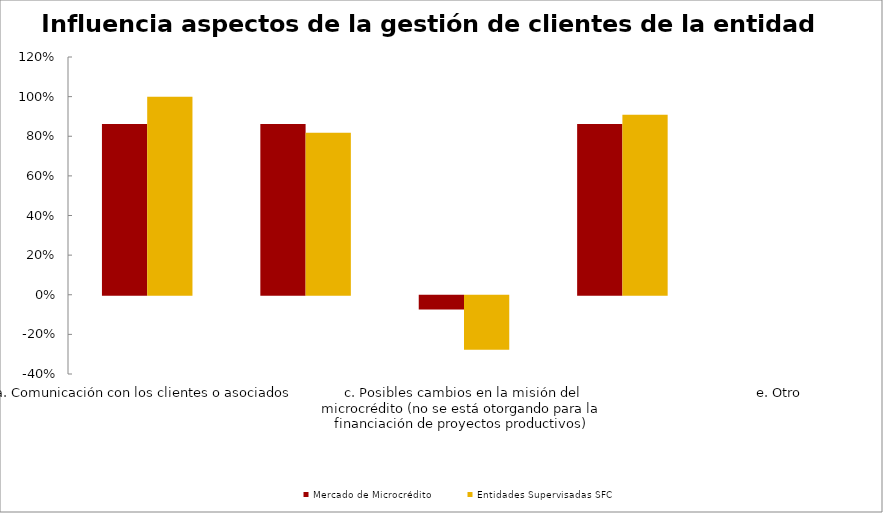
| Category | Mercado de Microcrédito | Entidades Supervisadas SFC |
|---|---|---|
| a. Comunicación con los clientes o asociados | 0.862 | 1 |
| b. Desarrollo de productos adecuados para los clientes o asociados | 0.862 | 0.818 |
| c. Posibles cambios en la misión del microcrédito (no se está otorgando para la financiación de proyectos productivos) | -0.069 | -0.273 |
| d. Apoyo del asesor de microcrédito | 0.862 | 0.909 |
| e. Otro | 0 | 0 |